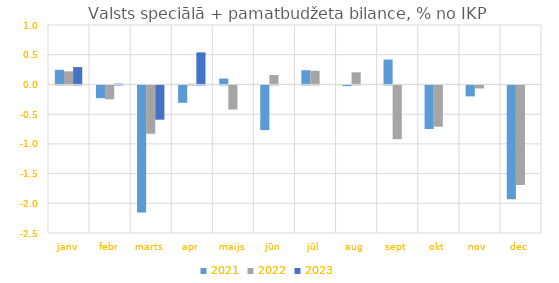
| Category | 2021 | 2022 | 2023 |
|---|---|---|---|
| janv | 0.246 | 0.22 | 0.292 |
| febr | -0.214 | -0.234 | 0.013 |
| marts | -2.139 | -0.813 | -0.577 |
| apr | -0.293 | 0.011 | 0.539 |
| maijs | 0.099 | -0.406 | 0 |
| jūn | -0.752 | 0.159 | 0 |
| jūl | 0.239 | 0.23 | 0 |
| aug | -0.011 | 0.204 | 0 |
| sept | 0.419 | -0.904 | 0 |
| okt | -0.734 | -0.695 | 0 |
| nov | -0.185 | -0.051 | 0 |
| dec | -1.916 | -1.677 | 0 |